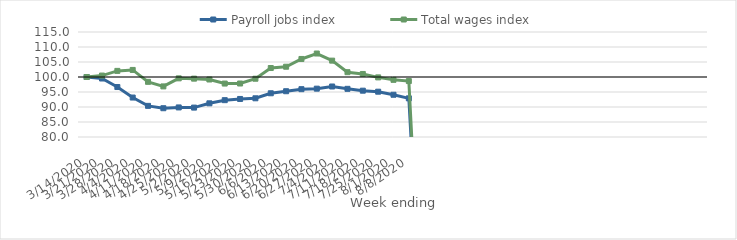
| Category | Payroll jobs index | Total wages index |
|---|---|---|
| 14/03/2020 | 100 | 100 |
| 21/03/2020 | 99.498 | 100.48 |
| 28/03/2020 | 96.652 | 102.037 |
| 04/04/2020 | 93.153 | 102.357 |
| 11/04/2020 | 90.378 | 98.39 |
| 18/04/2020 | 89.594 | 96.868 |
| 25/04/2020 | 89.854 | 99.549 |
| 02/05/2020 | 89.802 | 99.448 |
| 09/05/2020 | 91.226 | 99.167 |
| 16/05/2020 | 92.276 | 97.817 |
| 23/05/2020 | 92.68 | 97.832 |
| 30/05/2020 | 92.903 | 99.425 |
| 06/06/2020 | 94.575 | 102.994 |
| 13/06/2020 | 95.26 | 103.424 |
| 20/06/2020 | 95.941 | 106.012 |
| 27/06/2020 | 96.111 | 107.823 |
| 04/07/2020 | 96.835 | 105.457 |
| 11/07/2020 | 96.056 | 101.606 |
| 18/07/2020 | 95.44 | 101.012 |
| 25/07/2020 | 95.101 | 99.871 |
| 01/08/2020 | 94.08 | 99.055 |
| 08/08/2020 | 92.889 | 98.643 |